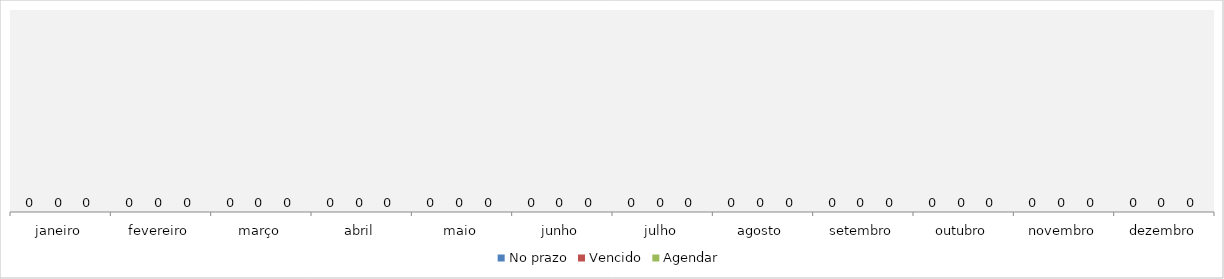
| Category | No prazo | Vencido | Agendar |
|---|---|---|---|
| janeiro | 0 | 0 | 0 |
| fevereiro | 0 | 0 | 0 |
| março | 0 | 0 | 0 |
| abril | 0 | 0 | 0 |
| maio | 0 | 0 | 0 |
| junho | 0 | 0 | 0 |
| julho | 0 | 0 | 0 |
| agosto | 0 | 0 | 0 |
| setembro | 0 | 0 | 0 |
| outubro | 0 | 0 | 0 |
| novembro | 0 | 0 | 0 |
| dezembro | 0 | 0 | 0 |